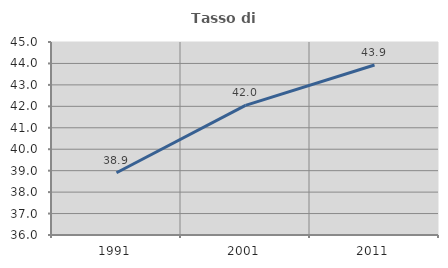
| Category | Tasso di occupazione   |
|---|---|
| 1991.0 | 38.903 |
| 2001.0 | 42.044 |
| 2011.0 | 43.927 |